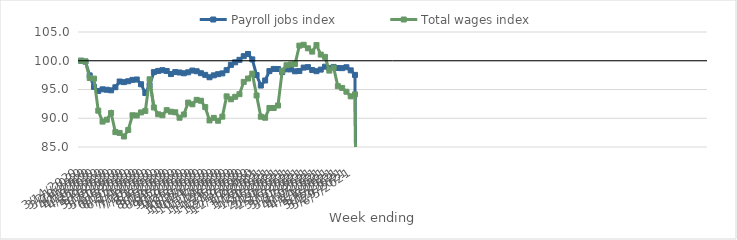
| Category | Payroll jobs index | Total wages index |
|---|---|---|
| 14/03/2020 | 100 | 100 |
| 21/03/2020 | 99.852 | 99.886 |
| 28/03/2020 | 97.445 | 96.999 |
| 04/04/2020 | 95.453 | 96.896 |
| 11/04/2020 | 94.751 | 91.316 |
| 18/04/2020 | 95.027 | 89.416 |
| 25/04/2020 | 94.958 | 89.747 |
| 02/05/2020 | 94.855 | 90.923 |
| 09/05/2020 | 95.391 | 87.588 |
| 16/05/2020 | 96.39 | 87.448 |
| 23/05/2020 | 96.287 | 86.826 |
| 30/05/2020 | 96.437 | 87.961 |
| 06/06/2020 | 96.676 | 90.517 |
| 13/06/2020 | 96.738 | 90.482 |
| 20/06/2020 | 95.915 | 91.016 |
| 27/06/2020 | 94.388 | 91.279 |
| 04/07/2020 | 95.738 | 96.781 |
| 11/07/2020 | 98.02 | 91.882 |
| 18/07/2020 | 98.231 | 90.686 |
| 25/07/2020 | 98.354 | 90.527 |
| 01/08/2020 | 98.221 | 91.408 |
| 08/08/2020 | 97.685 | 91.135 |
| 15/08/2020 | 98.029 | 91.04 |
| 22/08/2020 | 97.956 | 90.09 |
| 29/08/2020 | 97.818 | 90.65 |
| 05/09/2020 | 97.994 | 92.721 |
| 12/09/2020 | 98.296 | 92.428 |
| 19/09/2020 | 98.172 | 93.201 |
| 26/09/2020 | 97.836 | 93.046 |
| 03/10/2020 | 97.547 | 91.939 |
| 10/10/2020 | 97.129 | 89.617 |
| 17/10/2020 | 97.46 | 90.068 |
| 24/10/2020 | 97.664 | 89.565 |
| 31/10/2020 | 97.806 | 90.278 |
| 07/11/2020 | 98.363 | 93.806 |
| 14/11/2020 | 99.282 | 93.298 |
| 21/11/2020 | 99.727 | 93.734 |
| 28/11/2020 | 100.156 | 94.187 |
| 05/12/2020 | 100.798 | 96.319 |
| 12/12/2020 | 101.178 | 96.907 |
| 19/12/2020 | 100.239 | 97.757 |
| 26/12/2020 | 97.51 | 93.962 |
| 02/01/2021 | 95.688 | 90.268 |
| 09/01/2021 | 96.566 | 90.09 |
| 16/01/2021 | 98.2 | 91.78 |
| 23/01/2021 | 98.579 | 91.783 |
| 30/01/2021 | 98.558 | 92.219 |
| 06/02/2021 | 98.028 | 98.272 |
| 13/02/2021 | 98.511 | 99.218 |
| 20/02/2021 | 98.5 | 99.353 |
| 27/02/2021 | 98.165 | 99.448 |
| 06/03/2021 | 98.213 | 102.628 |
| 13/03/2021 | 98.811 | 102.778 |
| 20/03/2021 | 98.89 | 102.162 |
| 27/03/2021 | 98.381 | 101.591 |
| 03/04/2021 | 98.186 | 102.731 |
| 10/04/2021 | 98.46 | 101.073 |
| 17/04/2021 | 98.967 | 100.677 |
| 24/04/2021 | 98.739 | 98.285 |
| 01/05/2021 | 98.926 | 98.81 |
| 08/05/2021 | 98.728 | 95.57 |
| 15/05/2021 | 98.71 | 95.276 |
| 22/05/2021 | 98.867 | 94.609 |
| 29/05/2021 | 98.329 | 93.806 |
| 05/06/2021 | 97.539 | 94.156 |